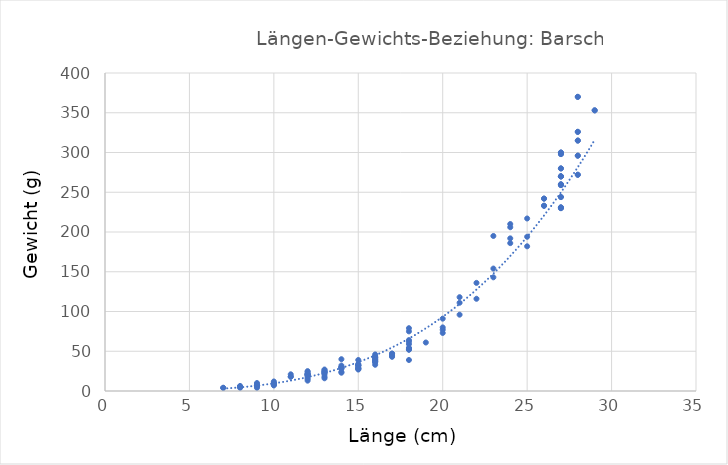
| Category | Series 0 |
|---|---|
| 7.0 | 4 |
| 7.0 | 4 |
| 8.0 | 6 |
| 8.0 | 6 |
| 8.0 | 6 |
| 8.0 | 5 |
| 8.0 | 4 |
| 9.0 | 4 |
| 9.0 | 7 |
| 9.0 | 8 |
| 9.0 | 10 |
| 9.0 | 6 |
| 9.0 | 7 |
| 9.0 | 7 |
| 9.0 | 6.6 |
| 9.0 | 6.6 |
| 10.0 | 8 |
| 10.0 | 12 |
| 10.0 | 9 |
| 10.0 | 8 |
| 10.0 | 7 |
| 10.0 | 10 |
| 10.0 | 10 |
| 11.0 | 21 |
| 11.0 | 18 |
| 11.0 | 18 |
| 12.0 | 20 |
| 12.0 | 22 |
| 12.0 | 21 |
| 12.0 | 25 |
| 12.0 | 24 |
| 12.0 | 21 |
| 12.0 | 13 |
| 12.0 | 19 |
| 12.0 | 20 |
| 12.0 | 21 |
| 12.0 | 15 |
| 12.0 | 17 |
| 13.0 | 26 |
| 13.0 | 18 |
| 13.0 | 16 |
| 13.0 | 21 |
| 13.0 | 23 |
| 13.0 | 25 |
| 13.0 | 27 |
| 13.0 | 23.7 |
| 13.0 | 23.7 |
| 14.0 | 30 |
| 14.0 | 40 |
| 14.0 | 32 |
| 14.0 | 30 |
| 14.0 | 23 |
| 14.0 | 29 |
| 14.0 | 28 |
| 14.0 | 29 |
| 14.0 | 24 |
| 15.0 | 28 |
| 15.0 | 32 |
| 15.0 | 39 |
| 15.0 | 32 |
| 15.0 | 27 |
| 15.0 | 29 |
| 15.0 | 32 |
| 15.0 | 33 |
| 15.0 | 28 |
| 15.0 | 29 |
| 15.0 | 34 |
| 16.0 | 46 |
| 16.0 | 37 |
| 16.0 | 42 |
| 16.0 | 37 |
| 16.0 | 41 |
| 16.0 | 38 |
| 16.0 | 43 |
| 16.0 | 40 |
| 16.0 | 39 |
| 16.0 | 42 |
| 16.0 | 39 |
| 16.0 | 36 |
| 16.0 | 44 |
| 16.0 | 33 |
| 17.0 | 45 |
| 17.0 | 47 |
| 17.0 | 44 |
| 17.0 | 43 |
| 17.0 | 47 |
| 18.0 | 54 |
| 18.0 | 79 |
| 18.0 | 52 |
| 18.0 | 64 |
| 18.0 | 75 |
| 18.0 | 62 |
| 18.0 | 54 |
| 18.0 | 39 |
| 18.0 | 52 |
| 18.0 | 59 |
| 19.0 | 61 |
| 20.0 | 91 |
| 20.0 | 80 |
| 20.0 | 77 |
| 20.0 | 73 |
| 21.0 | 111 |
| 21.0 | 96 |
| 21.0 | 118 |
| 22.0 | 116 |
| 22.0 | 136 |
| 23.0 | 143 |
| 23.0 | 154 |
| 23.0 | 195 |
| 24.0 | 206 |
| 24.0 | 210 |
| 24.0 | 186 |
| 24.0 | 192 |
| 25.0 | 182 |
| 25.0 | 194 |
| 25.0 | 217 |
| 26.0 | 242 |
| 26.0 | 233 |
| 27.0 | 231 |
| 27.0 | 259 |
| 27.0 | 270 |
| 27.0 | 270 |
| 27.0 | 230 |
| 27.0 | 260 |
| 27.0 | 300 |
| 27.0 | 280 |
| 27.0 | 298 |
| 27.0 | 244 |
| 28.0 | 326 |
| 28.0 | 370 |
| 28.0 | 296 |
| 28.0 | 315 |
| 28.0 | 272 |
| 29.0 | 353 |
| 26.0 | 242 |
| 26.0 | 233 |
| 27.0 | 231 |
| 27.0 | 259 |
| 27.0 | 270 |
| 27.0 | 270 |
| 27.0 | 230 |
| 27.0 | 260 |
| 27.0 | 300 |
| 27.0 | 280 |
| 27.0 | 298 |
| 27.0 | 244 |
| 28.0 | 326 |
| 28.0 | 370 |
| 28.0 | 296 |
| 28.0 | 315 |
| 28.0 | 272 |
| 29.0 | 353 |